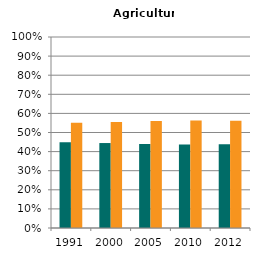
| Category | Male | Female |
|---|---|---|
| 1991.0 | 0.449 | 0.551 |
| 2000.0 | 0.445 | 0.555 |
| 2005.0 | 0.44 | 0.56 |
| 2010.0 | 0.437 | 0.563 |
| 2012.0 | 0.438 | 0.562 |